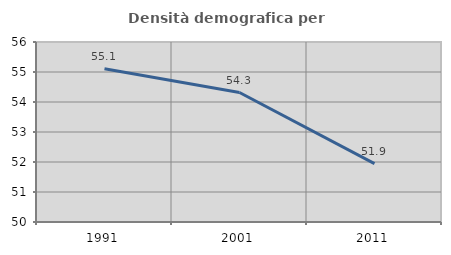
| Category | Densità demografica |
|---|---|
| 1991.0 | 55.107 |
| 2001.0 | 54.316 |
| 2011.0 | 51.944 |